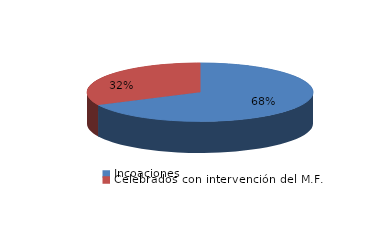
| Category | Series 0 |
|---|---|
| Incoaciones | 3819 |
| Celebrados con intervención del M.F. | 1812 |